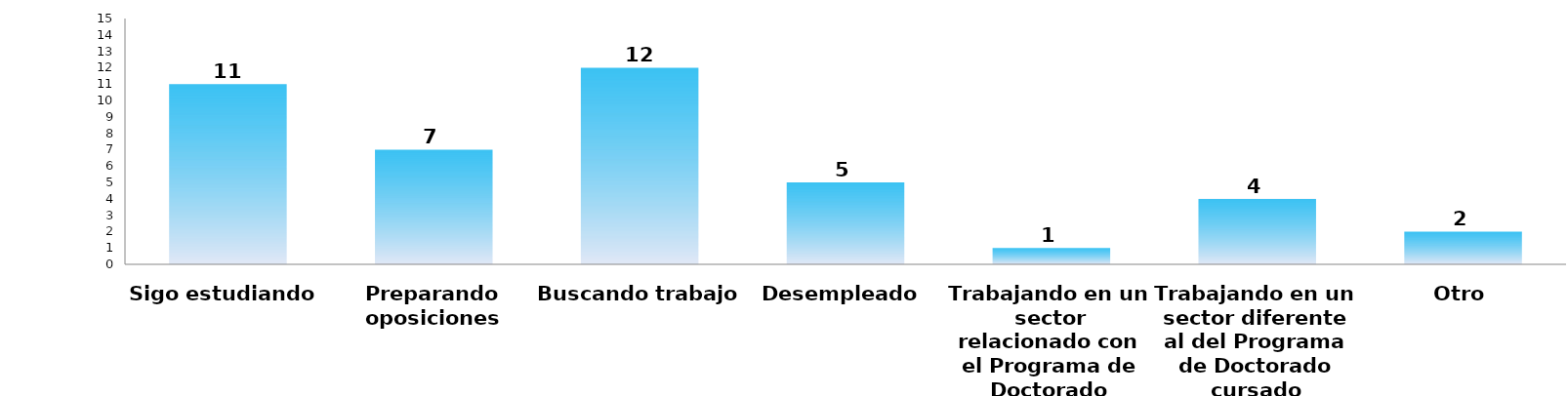
| Category | Series 0 |
|---|---|
| Sigo estudiando | 11 |
| Preparando oposiciones | 7 |
| Buscando trabajo | 12 |
| Desempleado | 5 |
| Trabajando en un sector relacionado con el Programa de Doctorado cursado | 1 |
| Trabajando en un sector diferente al del Programa de Doctorado cursado | 4 |
| Otro | 2 |